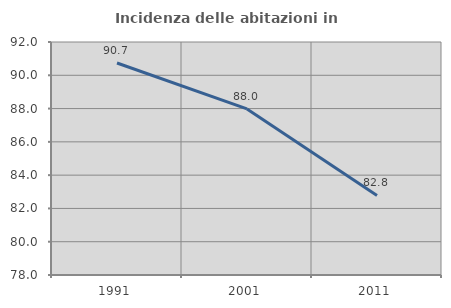
| Category | Incidenza delle abitazioni in proprietà  |
|---|---|
| 1991.0 | 90.738 |
| 2001.0 | 87.981 |
| 2011.0 | 82.781 |